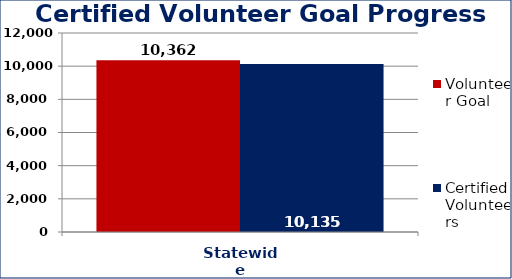
| Category | Volunteer Goal  | Certified Volunteers  |
|---|---|---|
| Statewide | 10362 | 10135 |